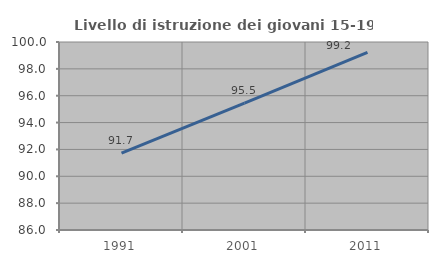
| Category | Livello di istruzione dei giovani 15-19 anni |
|---|---|
| 1991.0 | 91.729 |
| 2001.0 | 95.455 |
| 2011.0 | 99.231 |